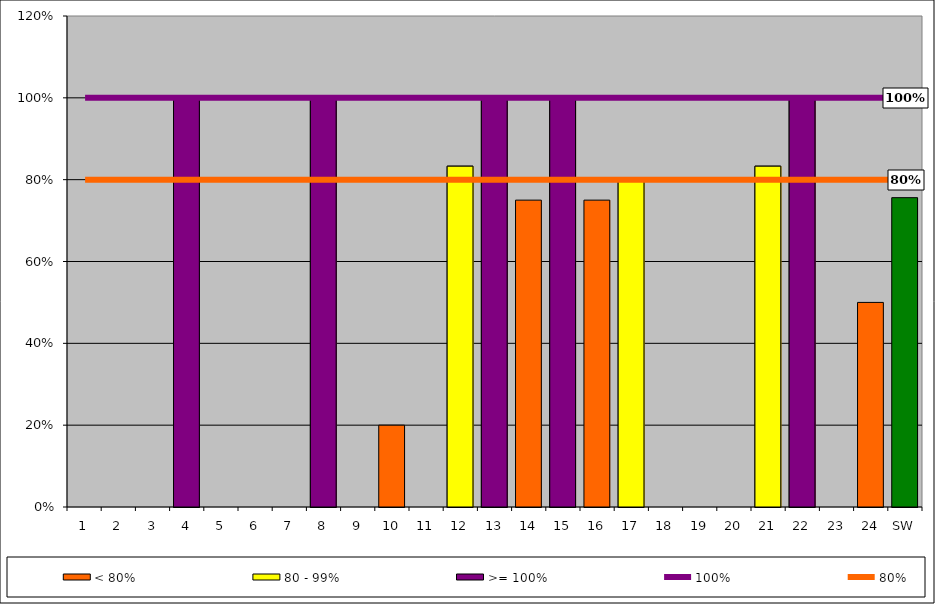
| Category | < 80% | 80 - 99% | >= 100% |
|---|---|---|---|
| 1 | 0 | 0 | 0 |
| 2 | 0 | 0 | 0 |
| 3 | 0 | 0 | 0 |
| 4 | 1 | 0 | 1 |
| 5 | 0 | 0 | 0 |
| 6 | 0 | 0 | 0 |
| 7 | 0 | 0 | 0 |
| 8 | 1 | 0 | 1 |
| 9 | 0 | 0 | 0 |
| 10 | 0.2 | 0 | 0 |
| 11 | 0 | 0 | 0 |
| 12 | 0.833 | 0.833 | 0 |
| 13 | 1 | 0 | 1 |
| 14 | 0.75 | 0 | 0 |
| 15 | 1 | 0 | 1 |
| 16 | 0.75 | 0 | 0 |
| 17 | 0.8 | 0.8 | 0 |
| 18 | 0 | 0 | 0 |
| 19 | 0 | 0 | 0 |
| 20 | 0 | 0 | 0 |
| 21 | 0.833 | 0.833 | 0 |
| 22 | 1 | 0 | 1 |
| 23 | 0 | 0 | 0 |
| 24 | 0.5 | 0 | 0 |
| SW | 0.756 | 0 | 0 |